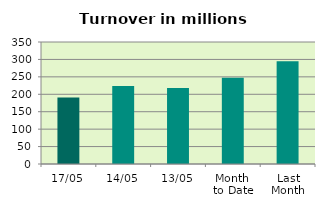
| Category | Series 0 |
|---|---|
| 17/05 | 190.478 |
| 14/05 | 224.082 |
| 13/05 | 217.829 |
| Month 
to Date | 247.602 |
| Last
Month | 294.539 |